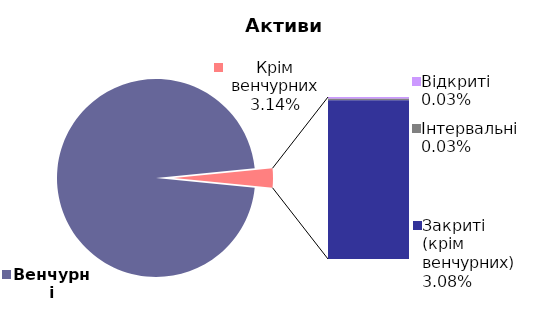
| Category | 30.06.2018 |
|---|---|
| Венчурні | 0.969 |
| Відкриті | 0 |
| Інтервальні | 0 |
| Закриті (крім венчурних) | 0.031 |